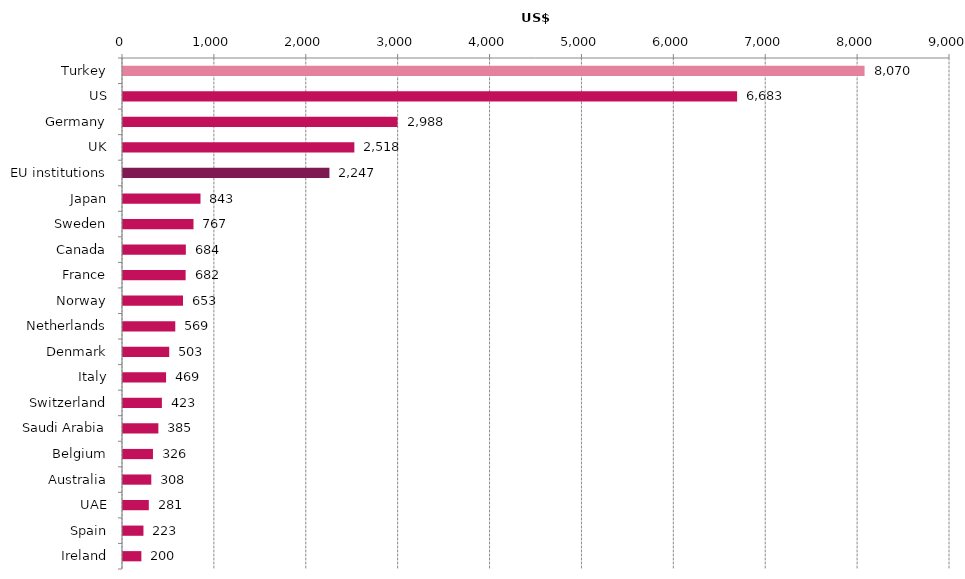
| Category | 2017 |
|---|---|
| Turkey | 8070.162 |
| US | 6683.208 |
| Germany | 2987.73 |
| UK | 2517.869 |
| EU institutions | 2246.592 |
| Japan | 843.323 |
| Sweden | 767.156 |
| Canada | 683.947 |
| France | 681.646 |
| Norway | 652.997 |
| Netherlands | 568.886 |
| Denmark | 502.993 |
| Italy | 468.752 |
| Switzerland | 423.248 |
| Saudi Arabia | 384.724 |
| Belgium | 326.164 |
| Australia | 307.983 |
| UAE | 281.01 |
| Spain | 222.638 |
| Ireland | 200.06 |